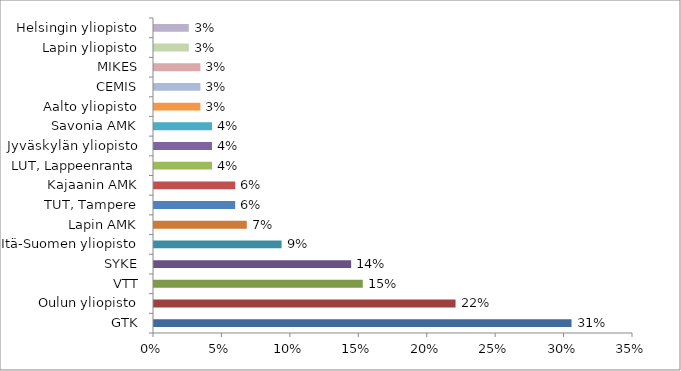
| Category | Series 0 |
|---|---|
| GTK | 0.305 |
| Oulun yliopisto | 0.22 |
| VTT | 0.153 |
| SYKE | 0.144 |
| Itä-Suomen yliopisto | 0.093 |
| Lapin AMK | 0.068 |
| TUT, Tampere | 0.059 |
| Kajaanin AMK | 0.059 |
| LUT, Lappeenranta | 0.042 |
| Jyväskylän yliopisto | 0.042 |
| Savonia AMK | 0.042 |
| Aalto yliopisto | 0.034 |
| CEMIS | 0.034 |
| MIKES | 0.034 |
| Lapin yliopisto | 0.025 |
| Helsingin yliopisto | 0.025 |